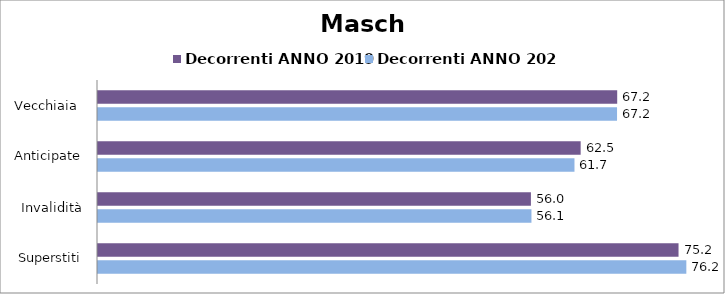
| Category | Decorrenti ANNO 2019 | Decorrenti ANNO 2020 |
|---|---|---|
| Vecchiaia  | 67.21 | 67.19 |
|  Anticipate | 62.48 | 61.68 |
| Invalidità | 56.04 | 56.11 |
| Superstiti | 75.15 | 76.16 |